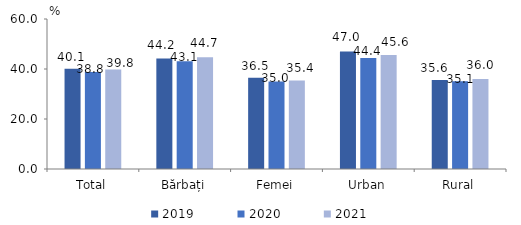
| Category | 2019 | 2020 | 2021 |
|---|---|---|---|
| Total | 40.1 | 38.8 | 39.8 |
| Bărbați | 44.2 | 43.1 | 44.7 |
| Femei | 36.5 | 35 | 35.4 |
| Urban | 47 | 44.4 | 45.6 |
| Rural | 35.6 | 35.1 | 36 |